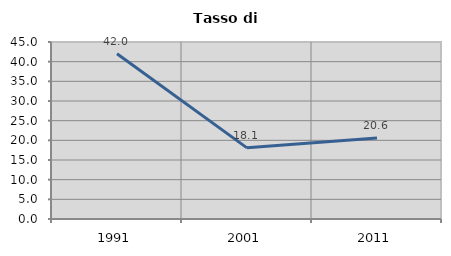
| Category | Tasso di disoccupazione   |
|---|---|
| 1991.0 | 42.026 |
| 2001.0 | 18.085 |
| 2011.0 | 20.588 |